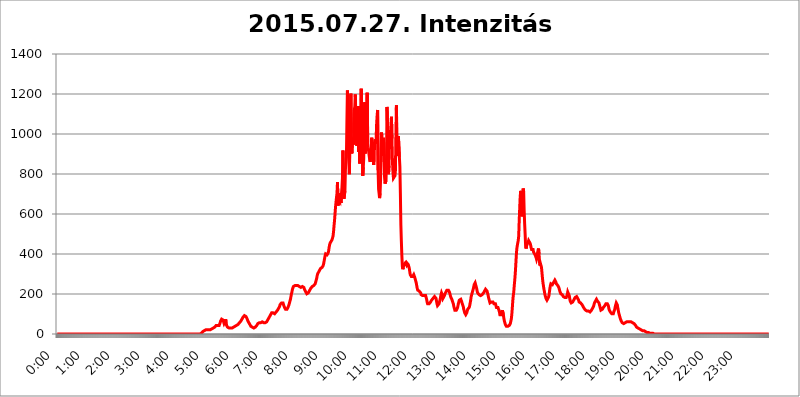
| Category | 2015.07.27. Intenzitás [W/m^2] |
|---|---|
| 0.0 | 0 |
| 0.0006944444444444445 | 0 |
| 0.001388888888888889 | 0 |
| 0.0020833333333333333 | 0 |
| 0.002777777777777778 | 0 |
| 0.003472222222222222 | 0 |
| 0.004166666666666667 | 0 |
| 0.004861111111111111 | 0 |
| 0.005555555555555556 | 0 |
| 0.0062499999999999995 | 0 |
| 0.006944444444444444 | 0 |
| 0.007638888888888889 | 0 |
| 0.008333333333333333 | 0 |
| 0.009027777777777779 | 0 |
| 0.009722222222222222 | 0 |
| 0.010416666666666666 | 0 |
| 0.011111111111111112 | 0 |
| 0.011805555555555555 | 0 |
| 0.012499999999999999 | 0 |
| 0.013194444444444444 | 0 |
| 0.013888888888888888 | 0 |
| 0.014583333333333332 | 0 |
| 0.015277777777777777 | 0 |
| 0.015972222222222224 | 0 |
| 0.016666666666666666 | 0 |
| 0.017361111111111112 | 0 |
| 0.018055555555555557 | 0 |
| 0.01875 | 0 |
| 0.019444444444444445 | 0 |
| 0.02013888888888889 | 0 |
| 0.020833333333333332 | 0 |
| 0.02152777777777778 | 0 |
| 0.022222222222222223 | 0 |
| 0.02291666666666667 | 0 |
| 0.02361111111111111 | 0 |
| 0.024305555555555556 | 0 |
| 0.024999999999999998 | 0 |
| 0.025694444444444447 | 0 |
| 0.02638888888888889 | 0 |
| 0.027083333333333334 | 0 |
| 0.027777777777777776 | 0 |
| 0.02847222222222222 | 0 |
| 0.029166666666666664 | 0 |
| 0.029861111111111113 | 0 |
| 0.030555555555555555 | 0 |
| 0.03125 | 0 |
| 0.03194444444444445 | 0 |
| 0.03263888888888889 | 0 |
| 0.03333333333333333 | 0 |
| 0.034027777777777775 | 0 |
| 0.034722222222222224 | 0 |
| 0.035416666666666666 | 0 |
| 0.036111111111111115 | 0 |
| 0.03680555555555556 | 0 |
| 0.0375 | 0 |
| 0.03819444444444444 | 0 |
| 0.03888888888888889 | 0 |
| 0.03958333333333333 | 0 |
| 0.04027777777777778 | 0 |
| 0.04097222222222222 | 0 |
| 0.041666666666666664 | 0 |
| 0.042361111111111106 | 0 |
| 0.04305555555555556 | 0 |
| 0.043750000000000004 | 0 |
| 0.044444444444444446 | 0 |
| 0.04513888888888889 | 0 |
| 0.04583333333333334 | 0 |
| 0.04652777777777778 | 0 |
| 0.04722222222222222 | 0 |
| 0.04791666666666666 | 0 |
| 0.04861111111111111 | 0 |
| 0.049305555555555554 | 0 |
| 0.049999999999999996 | 0 |
| 0.05069444444444445 | 0 |
| 0.051388888888888894 | 0 |
| 0.052083333333333336 | 0 |
| 0.05277777777777778 | 0 |
| 0.05347222222222222 | 0 |
| 0.05416666666666667 | 0 |
| 0.05486111111111111 | 0 |
| 0.05555555555555555 | 0 |
| 0.05625 | 0 |
| 0.05694444444444444 | 0 |
| 0.057638888888888885 | 0 |
| 0.05833333333333333 | 0 |
| 0.05902777777777778 | 0 |
| 0.059722222222222225 | 0 |
| 0.06041666666666667 | 0 |
| 0.061111111111111116 | 0 |
| 0.06180555555555556 | 0 |
| 0.0625 | 0 |
| 0.06319444444444444 | 0 |
| 0.06388888888888888 | 0 |
| 0.06458333333333334 | 0 |
| 0.06527777777777778 | 0 |
| 0.06597222222222222 | 0 |
| 0.06666666666666667 | 0 |
| 0.06736111111111111 | 0 |
| 0.06805555555555555 | 0 |
| 0.06874999999999999 | 0 |
| 0.06944444444444443 | 0 |
| 0.07013888888888889 | 0 |
| 0.07083333333333333 | 0 |
| 0.07152777777777779 | 0 |
| 0.07222222222222223 | 0 |
| 0.07291666666666667 | 0 |
| 0.07361111111111111 | 0 |
| 0.07430555555555556 | 0 |
| 0.075 | 0 |
| 0.07569444444444444 | 0 |
| 0.0763888888888889 | 0 |
| 0.07708333333333334 | 0 |
| 0.07777777777777778 | 0 |
| 0.07847222222222222 | 0 |
| 0.07916666666666666 | 0 |
| 0.0798611111111111 | 0 |
| 0.08055555555555556 | 0 |
| 0.08125 | 0 |
| 0.08194444444444444 | 0 |
| 0.08263888888888889 | 0 |
| 0.08333333333333333 | 0 |
| 0.08402777777777777 | 0 |
| 0.08472222222222221 | 0 |
| 0.08541666666666665 | 0 |
| 0.08611111111111112 | 0 |
| 0.08680555555555557 | 0 |
| 0.08750000000000001 | 0 |
| 0.08819444444444445 | 0 |
| 0.08888888888888889 | 0 |
| 0.08958333333333333 | 0 |
| 0.09027777777777778 | 0 |
| 0.09097222222222222 | 0 |
| 0.09166666666666667 | 0 |
| 0.09236111111111112 | 0 |
| 0.09305555555555556 | 0 |
| 0.09375 | 0 |
| 0.09444444444444444 | 0 |
| 0.09513888888888888 | 0 |
| 0.09583333333333333 | 0 |
| 0.09652777777777777 | 0 |
| 0.09722222222222222 | 0 |
| 0.09791666666666667 | 0 |
| 0.09861111111111111 | 0 |
| 0.09930555555555555 | 0 |
| 0.09999999999999999 | 0 |
| 0.10069444444444443 | 0 |
| 0.1013888888888889 | 0 |
| 0.10208333333333335 | 0 |
| 0.10277777777777779 | 0 |
| 0.10347222222222223 | 0 |
| 0.10416666666666667 | 0 |
| 0.10486111111111111 | 0 |
| 0.10555555555555556 | 0 |
| 0.10625 | 0 |
| 0.10694444444444444 | 0 |
| 0.1076388888888889 | 0 |
| 0.10833333333333334 | 0 |
| 0.10902777777777778 | 0 |
| 0.10972222222222222 | 0 |
| 0.1111111111111111 | 0 |
| 0.11180555555555556 | 0 |
| 0.11180555555555556 | 0 |
| 0.1125 | 0 |
| 0.11319444444444444 | 0 |
| 0.11388888888888889 | 0 |
| 0.11458333333333333 | 0 |
| 0.11527777777777777 | 0 |
| 0.11597222222222221 | 0 |
| 0.11666666666666665 | 0 |
| 0.1173611111111111 | 0 |
| 0.11805555555555557 | 0 |
| 0.11944444444444445 | 0 |
| 0.12013888888888889 | 0 |
| 0.12083333333333333 | 0 |
| 0.12152777777777778 | 0 |
| 0.12222222222222223 | 0 |
| 0.12291666666666667 | 0 |
| 0.12291666666666667 | 0 |
| 0.12361111111111112 | 0 |
| 0.12430555555555556 | 0 |
| 0.125 | 0 |
| 0.12569444444444444 | 0 |
| 0.12638888888888888 | 0 |
| 0.12708333333333333 | 0 |
| 0.16875 | 0 |
| 0.12847222222222224 | 0 |
| 0.12916666666666668 | 0 |
| 0.12986111111111112 | 0 |
| 0.13055555555555556 | 0 |
| 0.13125 | 0 |
| 0.13194444444444445 | 0 |
| 0.1326388888888889 | 0 |
| 0.13333333333333333 | 0 |
| 0.13402777777777777 | 0 |
| 0.13402777777777777 | 0 |
| 0.13472222222222222 | 0 |
| 0.13541666666666666 | 0 |
| 0.1361111111111111 | 0 |
| 0.13749999999999998 | 0 |
| 0.13819444444444443 | 0 |
| 0.1388888888888889 | 0 |
| 0.13958333333333334 | 0 |
| 0.14027777777777778 | 0 |
| 0.14097222222222222 | 0 |
| 0.14166666666666666 | 0 |
| 0.1423611111111111 | 0 |
| 0.14305555555555557 | 0 |
| 0.14375000000000002 | 0 |
| 0.14444444444444446 | 0 |
| 0.1451388888888889 | 0 |
| 0.1451388888888889 | 0 |
| 0.14652777777777778 | 0 |
| 0.14722222222222223 | 0 |
| 0.14791666666666667 | 0 |
| 0.1486111111111111 | 0 |
| 0.14930555555555555 | 0 |
| 0.15 | 0 |
| 0.15069444444444444 | 0 |
| 0.15138888888888888 | 0 |
| 0.15208333333333332 | 0 |
| 0.15277777777777776 | 0 |
| 0.15347222222222223 | 0 |
| 0.15416666666666667 | 0 |
| 0.15486111111111112 | 0 |
| 0.15555555555555556 | 0 |
| 0.15625 | 0 |
| 0.15694444444444444 | 0 |
| 0.15763888888888888 | 0 |
| 0.15833333333333333 | 0 |
| 0.15902777777777777 | 0 |
| 0.15972222222222224 | 0 |
| 0.16041666666666668 | 0 |
| 0.16111111111111112 | 0 |
| 0.16180555555555556 | 0 |
| 0.1625 | 0 |
| 0.16319444444444445 | 0 |
| 0.1638888888888889 | 0 |
| 0.16458333333333333 | 0 |
| 0.16527777777777777 | 0 |
| 0.16597222222222222 | 0 |
| 0.16666666666666666 | 0 |
| 0.1673611111111111 | 0 |
| 0.16805555555555554 | 0 |
| 0.16874999999999998 | 0 |
| 0.16944444444444443 | 0 |
| 0.17013888888888887 | 0 |
| 0.1708333333333333 | 0 |
| 0.17152777777777775 | 0 |
| 0.17222222222222225 | 0 |
| 0.1729166666666667 | 0 |
| 0.17361111111111113 | 0 |
| 0.17430555555555557 | 0 |
| 0.17500000000000002 | 0 |
| 0.17569444444444446 | 0 |
| 0.1763888888888889 | 0 |
| 0.17708333333333334 | 0 |
| 0.17777777777777778 | 0 |
| 0.17847222222222223 | 0 |
| 0.17916666666666667 | 0 |
| 0.1798611111111111 | 0 |
| 0.18055555555555555 | 0 |
| 0.18125 | 0 |
| 0.18194444444444444 | 0 |
| 0.1826388888888889 | 0 |
| 0.18333333333333335 | 0 |
| 0.1840277777777778 | 0 |
| 0.18472222222222223 | 0 |
| 0.18541666666666667 | 0 |
| 0.18611111111111112 | 0 |
| 0.18680555555555556 | 0 |
| 0.1875 | 0 |
| 0.18819444444444444 | 0 |
| 0.18888888888888888 | 0 |
| 0.18958333333333333 | 0 |
| 0.19027777777777777 | 0 |
| 0.1909722222222222 | 0 |
| 0.19166666666666665 | 0 |
| 0.19236111111111112 | 0 |
| 0.19305555555555554 | 0 |
| 0.19375 | 0 |
| 0.19444444444444445 | 0 |
| 0.1951388888888889 | 0 |
| 0.19583333333333333 | 0 |
| 0.19652777777777777 | 0 |
| 0.19722222222222222 | 0 |
| 0.19791666666666666 | 0 |
| 0.1986111111111111 | 0 |
| 0.19930555555555554 | 0 |
| 0.19999999999999998 | 0 |
| 0.20069444444444443 | 3.525 |
| 0.20138888888888887 | 3.525 |
| 0.2020833333333333 | 3.525 |
| 0.2027777777777778 | 7.887 |
| 0.2034722222222222 | 7.887 |
| 0.2041666666666667 | 12.257 |
| 0.20486111111111113 | 12.257 |
| 0.20555555555555557 | 12.257 |
| 0.20625000000000002 | 16.636 |
| 0.20694444444444446 | 16.636 |
| 0.2076388888888889 | 21.024 |
| 0.20833333333333334 | 21.024 |
| 0.20902777777777778 | 21.024 |
| 0.20972222222222223 | 21.024 |
| 0.21041666666666667 | 21.024 |
| 0.2111111111111111 | 21.024 |
| 0.21180555555555555 | 21.024 |
| 0.2125 | 21.024 |
| 0.21319444444444444 | 21.024 |
| 0.2138888888888889 | 21.024 |
| 0.21458333333333335 | 21.024 |
| 0.2152777777777778 | 21.024 |
| 0.21597222222222223 | 21.024 |
| 0.21666666666666667 | 25.419 |
| 0.21736111111111112 | 25.419 |
| 0.21805555555555556 | 25.419 |
| 0.21875 | 29.823 |
| 0.21944444444444444 | 29.823 |
| 0.22013888888888888 | 29.823 |
| 0.22083333333333333 | 34.234 |
| 0.22152777777777777 | 38.653 |
| 0.2222222222222222 | 38.653 |
| 0.22291666666666665 | 43.079 |
| 0.2236111111111111 | 43.079 |
| 0.22430555555555556 | 43.079 |
| 0.225 | 43.079 |
| 0.22569444444444445 | 43.079 |
| 0.2263888888888889 | 43.079 |
| 0.22708333333333333 | 43.079 |
| 0.22777777777777777 | 47.511 |
| 0.22847222222222222 | 56.398 |
| 0.22916666666666666 | 65.31 |
| 0.2298611111111111 | 69.775 |
| 0.23055555555555554 | 74.246 |
| 0.23124999999999998 | 74.246 |
| 0.23194444444444443 | 74.246 |
| 0.23263888888888887 | 69.775 |
| 0.2333333333333333 | 60.85 |
| 0.2340277777777778 | 51.951 |
| 0.2347222222222222 | 47.511 |
| 0.2354166666666667 | 60.85 |
| 0.23611111111111113 | 74.246 |
| 0.23680555555555557 | 60.85 |
| 0.23750000000000002 | 43.079 |
| 0.23819444444444446 | 38.653 |
| 0.2388888888888889 | 34.234 |
| 0.23958333333333334 | 34.234 |
| 0.24027777777777778 | 34.234 |
| 0.24097222222222223 | 29.823 |
| 0.24166666666666667 | 29.823 |
| 0.2423611111111111 | 29.823 |
| 0.24305555555555555 | 29.823 |
| 0.24375 | 29.823 |
| 0.24444444444444446 | 29.823 |
| 0.24513888888888888 | 29.823 |
| 0.24583333333333335 | 29.823 |
| 0.2465277777777778 | 34.234 |
| 0.24722222222222223 | 34.234 |
| 0.24791666666666667 | 34.234 |
| 0.24861111111111112 | 38.653 |
| 0.24930555555555556 | 38.653 |
| 0.25 | 38.653 |
| 0.25069444444444444 | 38.653 |
| 0.2513888888888889 | 43.079 |
| 0.2520833333333333 | 43.079 |
| 0.25277777777777777 | 47.511 |
| 0.2534722222222222 | 47.511 |
| 0.25416666666666665 | 47.511 |
| 0.2548611111111111 | 51.951 |
| 0.2555555555555556 | 56.398 |
| 0.25625000000000003 | 56.398 |
| 0.2569444444444445 | 60.85 |
| 0.2576388888888889 | 65.31 |
| 0.25833333333333336 | 69.775 |
| 0.2590277777777778 | 74.246 |
| 0.25972222222222224 | 78.722 |
| 0.2604166666666667 | 83.205 |
| 0.2611111111111111 | 87.692 |
| 0.26180555555555557 | 87.692 |
| 0.2625 | 92.184 |
| 0.26319444444444445 | 92.184 |
| 0.2638888888888889 | 87.692 |
| 0.26458333333333334 | 87.692 |
| 0.2652777777777778 | 83.205 |
| 0.2659722222222222 | 78.722 |
| 0.26666666666666666 | 74.246 |
| 0.2673611111111111 | 65.31 |
| 0.26805555555555555 | 60.85 |
| 0.26875 | 56.398 |
| 0.26944444444444443 | 51.951 |
| 0.2701388888888889 | 47.511 |
| 0.2708333333333333 | 43.079 |
| 0.27152777777777776 | 38.653 |
| 0.2722222222222222 | 38.653 |
| 0.27291666666666664 | 38.653 |
| 0.2736111111111111 | 34.234 |
| 0.2743055555555555 | 34.234 |
| 0.27499999999999997 | 34.234 |
| 0.27569444444444446 | 29.823 |
| 0.27638888888888885 | 34.234 |
| 0.27708333333333335 | 34.234 |
| 0.2777777777777778 | 34.234 |
| 0.27847222222222223 | 38.653 |
| 0.2791666666666667 | 38.653 |
| 0.2798611111111111 | 43.079 |
| 0.28055555555555556 | 47.511 |
| 0.28125 | 51.951 |
| 0.28194444444444444 | 51.951 |
| 0.2826388888888889 | 56.398 |
| 0.2833333333333333 | 56.398 |
| 0.28402777777777777 | 56.398 |
| 0.2847222222222222 | 56.398 |
| 0.28541666666666665 | 56.398 |
| 0.28611111111111115 | 56.398 |
| 0.28680555555555554 | 60.85 |
| 0.28750000000000003 | 60.85 |
| 0.2881944444444445 | 60.85 |
| 0.2888888888888889 | 56.398 |
| 0.28958333333333336 | 56.398 |
| 0.2902777777777778 | 56.398 |
| 0.29097222222222224 | 56.398 |
| 0.2916666666666667 | 56.398 |
| 0.2923611111111111 | 56.398 |
| 0.29305555555555557 | 56.398 |
| 0.29375 | 60.85 |
| 0.29444444444444445 | 65.31 |
| 0.2951388888888889 | 69.775 |
| 0.29583333333333334 | 74.246 |
| 0.2965277777777778 | 78.722 |
| 0.2972222222222222 | 83.205 |
| 0.29791666666666666 | 87.692 |
| 0.2986111111111111 | 92.184 |
| 0.29930555555555555 | 96.682 |
| 0.3 | 101.184 |
| 0.30069444444444443 | 105.69 |
| 0.3013888888888889 | 105.69 |
| 0.3020833333333333 | 105.69 |
| 0.30277777777777776 | 105.69 |
| 0.3034722222222222 | 105.69 |
| 0.30416666666666664 | 101.184 |
| 0.3048611111111111 | 101.184 |
| 0.3055555555555555 | 101.184 |
| 0.30624999999999997 | 105.69 |
| 0.3069444444444444 | 110.201 |
| 0.3076388888888889 | 114.716 |
| 0.30833333333333335 | 114.716 |
| 0.3090277777777778 | 119.235 |
| 0.30972222222222223 | 123.758 |
| 0.3104166666666667 | 128.284 |
| 0.3111111111111111 | 132.814 |
| 0.31180555555555556 | 137.347 |
| 0.3125 | 146.423 |
| 0.31319444444444444 | 150.964 |
| 0.3138888888888889 | 150.964 |
| 0.3145833333333333 | 155.509 |
| 0.31527777777777777 | 155.509 |
| 0.3159722222222222 | 155.509 |
| 0.31666666666666665 | 155.509 |
| 0.31736111111111115 | 146.423 |
| 0.31805555555555554 | 141.884 |
| 0.31875000000000003 | 132.814 |
| 0.3194444444444445 | 128.284 |
| 0.3201388888888889 | 123.758 |
| 0.32083333333333336 | 123.758 |
| 0.3215277777777778 | 123.758 |
| 0.32222222222222224 | 123.758 |
| 0.3229166666666667 | 128.284 |
| 0.3236111111111111 | 132.814 |
| 0.32430555555555557 | 137.347 |
| 0.325 | 146.423 |
| 0.32569444444444445 | 155.509 |
| 0.3263888888888889 | 164.605 |
| 0.32708333333333334 | 173.709 |
| 0.3277777777777778 | 187.378 |
| 0.3284722222222222 | 201.058 |
| 0.32916666666666666 | 210.182 |
| 0.3298611111111111 | 223.873 |
| 0.33055555555555555 | 228.436 |
| 0.33125 | 237.564 |
| 0.33194444444444443 | 242.127 |
| 0.3326388888888889 | 242.127 |
| 0.3333333333333333 | 242.127 |
| 0.3340277777777778 | 242.127 |
| 0.3347222222222222 | 242.127 |
| 0.3354166666666667 | 242.127 |
| 0.3361111111111111 | 242.127 |
| 0.3368055555555556 | 242.127 |
| 0.33749999999999997 | 242.127 |
| 0.33819444444444446 | 242.127 |
| 0.33888888888888885 | 237.564 |
| 0.33958333333333335 | 237.564 |
| 0.34027777777777773 | 233 |
| 0.34097222222222223 | 233 |
| 0.3416666666666666 | 233 |
| 0.3423611111111111 | 233 |
| 0.3430555555555555 | 233 |
| 0.34375 | 237.564 |
| 0.3444444444444445 | 237.564 |
| 0.3451388888888889 | 233 |
| 0.3458333333333334 | 233 |
| 0.34652777777777777 | 228.436 |
| 0.34722222222222227 | 219.309 |
| 0.34791666666666665 | 214.746 |
| 0.34861111111111115 | 210.182 |
| 0.34930555555555554 | 205.62 |
| 0.35000000000000003 | 201.058 |
| 0.3506944444444444 | 201.058 |
| 0.3513888888888889 | 201.058 |
| 0.3520833333333333 | 205.62 |
| 0.3527777777777778 | 205.62 |
| 0.3534722222222222 | 210.182 |
| 0.3541666666666667 | 219.309 |
| 0.3548611111111111 | 223.873 |
| 0.35555555555555557 | 228.436 |
| 0.35625 | 233 |
| 0.35694444444444445 | 233 |
| 0.3576388888888889 | 237.564 |
| 0.35833333333333334 | 237.564 |
| 0.3590277777777778 | 237.564 |
| 0.3597222222222222 | 242.127 |
| 0.36041666666666666 | 242.127 |
| 0.3611111111111111 | 246.689 |
| 0.36180555555555555 | 251.251 |
| 0.3625 | 260.373 |
| 0.36319444444444443 | 269.49 |
| 0.3638888888888889 | 278.603 |
| 0.3645833333333333 | 292.259 |
| 0.3652777777777778 | 301.354 |
| 0.3659722222222222 | 305.898 |
| 0.3666666666666667 | 310.44 |
| 0.3673611111111111 | 314.98 |
| 0.3680555555555556 | 319.517 |
| 0.36874999999999997 | 324.052 |
| 0.36944444444444446 | 328.584 |
| 0.37013888888888885 | 333.113 |
| 0.37083333333333335 | 333.113 |
| 0.37152777777777773 | 333.113 |
| 0.37222222222222223 | 333.113 |
| 0.3729166666666666 | 342.162 |
| 0.3736111111111111 | 351.198 |
| 0.3743055555555555 | 364.728 |
| 0.375 | 378.224 |
| 0.3756944444444445 | 391.685 |
| 0.3763888888888889 | 400.638 |
| 0.3770833333333334 | 400.638 |
| 0.37777777777777777 | 400.638 |
| 0.37847222222222227 | 396.164 |
| 0.37916666666666665 | 396.164 |
| 0.37986111111111115 | 405.108 |
| 0.38055555555555554 | 414.035 |
| 0.38125000000000003 | 431.833 |
| 0.3819444444444444 | 445.129 |
| 0.3826388888888889 | 453.968 |
| 0.3833333333333333 | 458.38 |
| 0.3840277777777778 | 462.786 |
| 0.3847222222222222 | 467.187 |
| 0.3854166666666667 | 471.582 |
| 0.3861111111111111 | 475.972 |
| 0.38680555555555557 | 489.108 |
| 0.3875 | 510.885 |
| 0.38819444444444445 | 541.121 |
| 0.3888888888888889 | 566.793 |
| 0.38958333333333334 | 600.661 |
| 0.3902777777777778 | 634.105 |
| 0.3909722222222222 | 658.909 |
| 0.39166666666666666 | 683.473 |
| 0.3923611111111111 | 703.762 |
| 0.39305555555555555 | 759.723 |
| 0.39375 | 642.4 |
| 0.39444444444444443 | 642.4 |
| 0.3951388888888889 | 671.22 |
| 0.3958333333333333 | 675.311 |
| 0.3965277777777778 | 663.019 |
| 0.3972222222222222 | 703.762 |
| 0.3979166666666667 | 654.791 |
| 0.3986111111111111 | 699.717 |
| 0.3993055555555556 | 731.896 |
| 0.39999999999999997 | 779.42 |
| 0.40069444444444446 | 917.534 |
| 0.40138888888888885 | 719.877 |
| 0.40208333333333335 | 675.311 |
| 0.40277777777777773 | 679.395 |
| 0.40347222222222223 | 715.858 |
| 0.4041666666666666 | 822.26 |
| 0.4048611111111111 | 822.26 |
| 0.4055555555555555 | 883.516 |
| 0.40625 | 1059.756 |
| 0.4069444444444445 | 1217.812 |
| 0.4076388888888889 | 1162.571 |
| 0.4083333333333334 | 1105.019 |
| 0.40902777777777777 | 872.114 |
| 0.40972222222222227 | 798.974 |
| 0.41041666666666665 | 977.508 |
| 0.41111111111111115 | 1101.226 |
| 0.41180555555555554 | 1201.843 |
| 0.41250000000000003 | 1003.65 |
| 0.4131944444444444 | 902.447 |
| 0.4138888888888889 | 955.071 |
| 0.4145833333333333 | 962.555 |
| 0.4152777777777778 | 981.244 |
| 0.4159722222222222 | 947.58 |
| 0.4166666666666667 | 1120.238 |
| 0.4173611111111111 | 1139.384 |
| 0.41805555555555557 | 1197.876 |
| 0.41875 | 1086.097 |
| 0.41944444444444445 | 973.772 |
| 0.4201388888888889 | 940.082 |
| 0.42083333333333334 | 955.071 |
| 0.4215277777777778 | 947.58 |
| 0.4222222222222222 | 1139.384 |
| 0.42291666666666666 | 909.996 |
| 0.4236111111111111 | 970.034 |
| 0.42430555555555555 | 853.029 |
| 0.425 | 1101.226 |
| 0.42569444444444443 | 996.182 |
| 0.4263888888888889 | 1225.859 |
| 0.4270833333333333 | 1029.798 |
| 0.4277777777777778 | 1041.019 |
| 0.4284722222222222 | 791.169 |
| 0.4291666666666667 | 833.834 |
| 0.4298611111111111 | 875.918 |
| 0.4305555555555556 | 1078.555 |
| 0.43124999999999997 | 1158.689 |
| 0.43194444444444446 | 902.447 |
| 0.43263888888888885 | 1131.708 |
| 0.43333333333333335 | 1074.789 |
| 0.43402777777777773 | 951.327 |
| 0.43472222222222223 | 1205.82 |
| 0.4354166666666666 | 958.814 |
| 0.4361111111111111 | 932.576 |
| 0.4368055555555555 | 932.576 |
| 0.4375 | 891.099 |
| 0.4381944444444445 | 872.114 |
| 0.4388888888888889 | 860.676 |
| 0.4395833333333334 | 925.06 |
| 0.44027777777777777 | 898.668 |
| 0.44097222222222227 | 981.244 |
| 0.44166666666666665 | 902.447 |
| 0.44236111111111115 | 872.114 |
| 0.44305555555555554 | 906.223 |
| 0.44375000000000003 | 845.365 |
| 0.4444444444444444 | 879.719 |
| 0.4451388888888889 | 962.555 |
| 0.4458333333333333 | 973.772 |
| 0.4465277777777778 | 951.327 |
| 0.4472222222222222 | 970.034 |
| 0.4479166666666667 | 1048.508 |
| 0.4486111111111111 | 1089.873 |
| 0.44930555555555557 | 1120.238 |
| 0.45 | 818.392 |
| 0.45069444444444445 | 723.889 |
| 0.4513888888888889 | 703.762 |
| 0.45208333333333334 | 679.395 |
| 0.4527777777777778 | 703.762 |
| 0.4534722222222222 | 771.559 |
| 0.45416666666666666 | 925.06 |
| 0.4548611111111111 | 1007.383 |
| 0.45555555555555555 | 962.555 |
| 0.45625 | 891.099 |
| 0.45694444444444443 | 936.33 |
| 0.4576388888888889 | 981.244 |
| 0.4583333333333333 | 860.676 |
| 0.4590277777777778 | 787.258 |
| 0.4597222222222222 | 751.803 |
| 0.4604166666666667 | 751.803 |
| 0.4611111111111111 | 767.62 |
| 0.4618055555555556 | 875.918 |
| 0.46249999999999997 | 1135.543 |
| 0.46319444444444446 | 1044.762 |
| 0.46388888888888885 | 860.676 |
| 0.46458333333333335 | 798.974 |
| 0.46527777777777773 | 841.526 |
| 0.46597222222222223 | 947.58 |
| 0.4666666666666666 | 999.916 |
| 0.4673611111111111 | 1007.383 |
| 0.4680555555555555 | 1007.383 |
| 0.46875 | 1086.097 |
| 0.4694444444444445 | 977.508 |
| 0.4701388888888889 | 860.676 |
| 0.4708333333333334 | 810.641 |
| 0.47152777777777777 | 779.42 |
| 0.47222222222222227 | 779.42 |
| 0.47291666666666665 | 783.342 |
| 0.47361111111111115 | 791.169 |
| 0.47430555555555554 | 818.392 |
| 0.47500000000000003 | 999.916 |
| 0.4756944444444444 | 1143.232 |
| 0.4763888888888889 | 917.534 |
| 0.4770833333333333 | 984.98 |
| 0.4777777777777778 | 891.099 |
| 0.4784722222222222 | 988.714 |
| 0.4791666666666667 | 992.448 |
| 0.4798611111111111 | 883.516 |
| 0.48055555555555557 | 837.682 |
| 0.48125 | 703.762 |
| 0.48194444444444445 | 545.416 |
| 0.4826388888888889 | 462.786 |
| 0.48333333333333334 | 391.685 |
| 0.4840277777777778 | 337.639 |
| 0.4847222222222222 | 324.052 |
| 0.48541666666666666 | 333.113 |
| 0.4861111111111111 | 346.682 |
| 0.48680555555555555 | 351.198 |
| 0.4875 | 351.198 |
| 0.48819444444444443 | 355.712 |
| 0.4888888888888889 | 351.198 |
| 0.4895833333333333 | 346.682 |
| 0.4902777777777778 | 355.712 |
| 0.4909722222222222 | 355.712 |
| 0.4916666666666667 | 351.198 |
| 0.4923611111111111 | 346.682 |
| 0.4930555555555556 | 337.639 |
| 0.49374999999999997 | 328.584 |
| 0.49444444444444446 | 310.44 |
| 0.49513888888888885 | 296.808 |
| 0.49583333333333335 | 292.259 |
| 0.49652777777777773 | 287.709 |
| 0.49722222222222223 | 287.709 |
| 0.4979166666666666 | 287.709 |
| 0.4986111111111111 | 287.709 |
| 0.4993055555555555 | 292.259 |
| 0.5 | 296.808 |
| 0.5006944444444444 | 292.259 |
| 0.5013888888888889 | 283.156 |
| 0.5020833333333333 | 274.047 |
| 0.5027777777777778 | 264.932 |
| 0.5034722222222222 | 255.813 |
| 0.5041666666666667 | 242.127 |
| 0.5048611111111111 | 228.436 |
| 0.5055555555555555 | 219.309 |
| 0.50625 | 214.746 |
| 0.5069444444444444 | 214.746 |
| 0.5076388888888889 | 214.746 |
| 0.5083333333333333 | 214.746 |
| 0.5090277777777777 | 210.182 |
| 0.5097222222222222 | 205.62 |
| 0.5104166666666666 | 196.497 |
| 0.5111111111111112 | 191.937 |
| 0.5118055555555555 | 191.937 |
| 0.5125000000000001 | 191.937 |
| 0.5131944444444444 | 191.937 |
| 0.513888888888889 | 191.937 |
| 0.5145833333333333 | 191.937 |
| 0.5152777777777778 | 196.497 |
| 0.5159722222222222 | 196.497 |
| 0.5166666666666667 | 191.937 |
| 0.517361111111111 | 182.82 |
| 0.5180555555555556 | 173.709 |
| 0.5187499999999999 | 160.056 |
| 0.5194444444444445 | 150.964 |
| 0.5201388888888888 | 146.423 |
| 0.5208333333333334 | 146.423 |
| 0.5215277777777778 | 150.964 |
| 0.5222222222222223 | 150.964 |
| 0.5229166666666667 | 155.509 |
| 0.5236111111111111 | 160.056 |
| 0.5243055555555556 | 164.605 |
| 0.525 | 169.156 |
| 0.5256944444444445 | 173.709 |
| 0.5263888888888889 | 173.709 |
| 0.5270833333333333 | 178.264 |
| 0.5277777777777778 | 182.82 |
| 0.5284722222222222 | 182.82 |
| 0.5291666666666667 | 187.378 |
| 0.5298611111111111 | 187.378 |
| 0.5305555555555556 | 182.82 |
| 0.53125 | 178.264 |
| 0.5319444444444444 | 164.605 |
| 0.5326388888888889 | 150.964 |
| 0.5333333333333333 | 141.884 |
| 0.5340277777777778 | 141.884 |
| 0.5347222222222222 | 146.423 |
| 0.5354166666666667 | 150.964 |
| 0.5361111111111111 | 155.509 |
| 0.5368055555555555 | 169.156 |
| 0.5375 | 182.82 |
| 0.5381944444444444 | 196.497 |
| 0.5388888888888889 | 205.62 |
| 0.5395833333333333 | 201.058 |
| 0.5402777777777777 | 191.937 |
| 0.5409722222222222 | 178.264 |
| 0.5416666666666666 | 178.264 |
| 0.5423611111111112 | 182.82 |
| 0.5430555555555555 | 191.937 |
| 0.5437500000000001 | 201.058 |
| 0.5444444444444444 | 205.62 |
| 0.545138888888889 | 210.182 |
| 0.5458333333333333 | 214.746 |
| 0.5465277777777778 | 219.309 |
| 0.5472222222222222 | 219.309 |
| 0.5479166666666667 | 219.309 |
| 0.548611111111111 | 219.309 |
| 0.5493055555555556 | 214.746 |
| 0.5499999999999999 | 210.182 |
| 0.5506944444444445 | 201.058 |
| 0.5513888888888888 | 191.937 |
| 0.5520833333333334 | 182.82 |
| 0.5527777777777778 | 178.264 |
| 0.5534722222222223 | 173.709 |
| 0.5541666666666667 | 164.605 |
| 0.5548611111111111 | 160.056 |
| 0.5555555555555556 | 150.964 |
| 0.55625 | 137.347 |
| 0.5569444444444445 | 128.284 |
| 0.5576388888888889 | 119.235 |
| 0.5583333333333333 | 114.716 |
| 0.5590277777777778 | 114.716 |
| 0.5597222222222222 | 119.235 |
| 0.5604166666666667 | 119.235 |
| 0.5611111111111111 | 128.284 |
| 0.5618055555555556 | 137.347 |
| 0.5625 | 150.964 |
| 0.5631944444444444 | 160.056 |
| 0.5638888888888889 | 169.156 |
| 0.5645833333333333 | 173.709 |
| 0.5652777777777778 | 173.709 |
| 0.5659722222222222 | 173.709 |
| 0.5666666666666667 | 169.156 |
| 0.5673611111111111 | 160.056 |
| 0.5680555555555555 | 150.964 |
| 0.56875 | 146.423 |
| 0.5694444444444444 | 137.347 |
| 0.5701388888888889 | 123.758 |
| 0.5708333333333333 | 114.716 |
| 0.5715277777777777 | 105.69 |
| 0.5722222222222222 | 101.184 |
| 0.5729166666666666 | 96.682 |
| 0.5736111111111112 | 101.184 |
| 0.5743055555555555 | 105.69 |
| 0.5750000000000001 | 114.716 |
| 0.5756944444444444 | 123.758 |
| 0.576388888888889 | 128.284 |
| 0.5770833333333333 | 128.284 |
| 0.5777777777777778 | 132.814 |
| 0.5784722222222222 | 141.884 |
| 0.5791666666666667 | 155.509 |
| 0.579861111111111 | 169.156 |
| 0.5805555555555556 | 187.378 |
| 0.5812499999999999 | 196.497 |
| 0.5819444444444445 | 205.62 |
| 0.5826388888888888 | 214.746 |
| 0.5833333333333334 | 223.873 |
| 0.5840277777777778 | 233 |
| 0.5847222222222223 | 246.689 |
| 0.5854166666666667 | 251.251 |
| 0.5861111111111111 | 255.813 |
| 0.5868055555555556 | 246.689 |
| 0.5875 | 237.564 |
| 0.5881944444444445 | 228.436 |
| 0.5888888888888889 | 214.746 |
| 0.5895833333333333 | 205.62 |
| 0.5902777777777778 | 201.058 |
| 0.5909722222222222 | 201.058 |
| 0.5916666666666667 | 196.497 |
| 0.5923611111111111 | 196.497 |
| 0.5930555555555556 | 191.937 |
| 0.59375 | 191.937 |
| 0.5944444444444444 | 191.937 |
| 0.5951388888888889 | 191.937 |
| 0.5958333333333333 | 196.497 |
| 0.5965277777777778 | 196.497 |
| 0.5972222222222222 | 201.058 |
| 0.5979166666666667 | 205.62 |
| 0.5986111111111111 | 210.182 |
| 0.5993055555555555 | 214.746 |
| 0.6 | 219.309 |
| 0.6006944444444444 | 223.873 |
| 0.6013888888888889 | 223.873 |
| 0.6020833333333333 | 219.309 |
| 0.6027777777777777 | 214.746 |
| 0.6034722222222222 | 205.62 |
| 0.6041666666666666 | 196.497 |
| 0.6048611111111112 | 182.82 |
| 0.6055555555555555 | 173.709 |
| 0.6062500000000001 | 164.605 |
| 0.6069444444444444 | 155.509 |
| 0.607638888888889 | 150.964 |
| 0.6083333333333333 | 155.509 |
| 0.6090277777777778 | 160.056 |
| 0.6097222222222222 | 164.605 |
| 0.6104166666666667 | 164.605 |
| 0.611111111111111 | 160.056 |
| 0.6118055555555556 | 155.509 |
| 0.6124999999999999 | 150.964 |
| 0.6131944444444445 | 150.964 |
| 0.6138888888888888 | 155.509 |
| 0.6145833333333334 | 150.964 |
| 0.6152777777777778 | 141.884 |
| 0.6159722222222223 | 132.814 |
| 0.6166666666666667 | 132.814 |
| 0.6173611111111111 | 137.347 |
| 0.6180555555555556 | 132.814 |
| 0.61875 | 128.284 |
| 0.6194444444444445 | 119.235 |
| 0.6201388888888889 | 110.201 |
| 0.6208333333333333 | 96.682 |
| 0.6215277777777778 | 92.184 |
| 0.6222222222222222 | 92.184 |
| 0.6229166666666667 | 96.682 |
| 0.6236111111111111 | 110.201 |
| 0.6243055555555556 | 119.235 |
| 0.625 | 114.716 |
| 0.6256944444444444 | 96.682 |
| 0.6263888888888889 | 78.722 |
| 0.6270833333333333 | 65.31 |
| 0.6277777777777778 | 56.398 |
| 0.6284722222222222 | 47.511 |
| 0.6291666666666667 | 43.079 |
| 0.6298611111111111 | 38.653 |
| 0.6305555555555555 | 38.653 |
| 0.63125 | 38.653 |
| 0.6319444444444444 | 38.653 |
| 0.6326388888888889 | 38.653 |
| 0.6333333333333333 | 38.653 |
| 0.6340277777777777 | 43.079 |
| 0.6347222222222222 | 47.511 |
| 0.6354166666666666 | 51.951 |
| 0.6361111111111112 | 56.398 |
| 0.6368055555555555 | 74.246 |
| 0.6375000000000001 | 96.682 |
| 0.6381944444444444 | 128.284 |
| 0.638888888888889 | 164.605 |
| 0.6395833333333333 | 191.937 |
| 0.6402777777777778 | 210.182 |
| 0.6409722222222222 | 242.127 |
| 0.6416666666666667 | 269.49 |
| 0.642361111111111 | 301.354 |
| 0.6430555555555556 | 342.162 |
| 0.6437499999999999 | 387.202 |
| 0.6444444444444445 | 422.943 |
| 0.6451388888888888 | 440.702 |
| 0.6458333333333334 | 445.129 |
| 0.6465277777777778 | 467.187 |
| 0.6472222222222223 | 489.108 |
| 0.6479166666666667 | 566.793 |
| 0.6486111111111111 | 629.948 |
| 0.6493055555555556 | 687.544 |
| 0.65 | 715.858 |
| 0.6506944444444445 | 687.544 |
| 0.6513888888888889 | 625.784 |
| 0.6520833333333333 | 588.009 |
| 0.6527777777777778 | 654.791 |
| 0.6534722222222222 | 727.896 |
| 0.6541666666666667 | 711.832 |
| 0.6548611111111111 | 617.436 |
| 0.6555555555555556 | 549.704 |
| 0.65625 | 497.836 |
| 0.6569444444444444 | 436.27 |
| 0.6576388888888889 | 427.39 |
| 0.6583333333333333 | 440.702 |
| 0.6590277777777778 | 449.551 |
| 0.6597222222222222 | 453.968 |
| 0.6604166666666667 | 458.38 |
| 0.6611111111111111 | 467.187 |
| 0.6618055555555555 | 467.187 |
| 0.6625 | 462.786 |
| 0.6631944444444444 | 453.968 |
| 0.6638888888888889 | 445.129 |
| 0.6645833333333333 | 431.833 |
| 0.6652777777777777 | 422.943 |
| 0.6659722222222222 | 422.943 |
| 0.6666666666666666 | 427.39 |
| 0.6673611111111111 | 422.943 |
| 0.6680555555555556 | 409.574 |
| 0.6687500000000001 | 409.574 |
| 0.6694444444444444 | 405.108 |
| 0.6701388888888888 | 396.164 |
| 0.6708333333333334 | 391.685 |
| 0.6715277777777778 | 382.715 |
| 0.6722222222222222 | 373.729 |
| 0.6729166666666666 | 382.715 |
| 0.6736111111111112 | 405.108 |
| 0.6743055555555556 | 418.492 |
| 0.6749999999999999 | 427.39 |
| 0.6756944444444444 | 400.638 |
| 0.6763888888888889 | 355.712 |
| 0.6770833333333334 | 342.162 |
| 0.6777777777777777 | 351.198 |
| 0.6784722222222223 | 351.198 |
| 0.6791666666666667 | 333.113 |
| 0.6798611111111111 | 305.898 |
| 0.6805555555555555 | 278.603 |
| 0.68125 | 255.813 |
| 0.6819444444444445 | 255.813 |
| 0.6826388888888889 | 223.873 |
| 0.6833333333333332 | 210.182 |
| 0.6840277777777778 | 196.497 |
| 0.6847222222222222 | 187.378 |
| 0.6854166666666667 | 178.264 |
| 0.686111111111111 | 173.709 |
| 0.6868055555555556 | 169.156 |
| 0.6875 | 169.156 |
| 0.6881944444444444 | 173.709 |
| 0.688888888888889 | 182.82 |
| 0.6895833333333333 | 191.937 |
| 0.6902777777777778 | 210.182 |
| 0.6909722222222222 | 228.436 |
| 0.6916666666666668 | 242.127 |
| 0.6923611111111111 | 251.251 |
| 0.6930555555555555 | 251.251 |
| 0.69375 | 251.251 |
| 0.6944444444444445 | 246.689 |
| 0.6951388888888889 | 246.689 |
| 0.6958333333333333 | 251.251 |
| 0.6965277777777777 | 260.373 |
| 0.6972222222222223 | 264.932 |
| 0.6979166666666666 | 269.49 |
| 0.6986111111111111 | 264.932 |
| 0.6993055555555556 | 260.373 |
| 0.7000000000000001 | 251.251 |
| 0.7006944444444444 | 246.689 |
| 0.7013888888888888 | 246.689 |
| 0.7020833333333334 | 242.127 |
| 0.7027777777777778 | 237.564 |
| 0.7034722222222222 | 233 |
| 0.7041666666666666 | 228.436 |
| 0.7048611111111112 | 214.746 |
| 0.7055555555555556 | 210.182 |
| 0.7062499999999999 | 201.058 |
| 0.7069444444444444 | 201.058 |
| 0.7076388888888889 | 196.497 |
| 0.7083333333333334 | 196.497 |
| 0.7090277777777777 | 191.937 |
| 0.7097222222222223 | 187.378 |
| 0.7104166666666667 | 182.82 |
| 0.7111111111111111 | 182.82 |
| 0.7118055555555555 | 182.82 |
| 0.7125 | 187.378 |
| 0.7131944444444445 | 182.82 |
| 0.7138888888888889 | 182.82 |
| 0.7145833333333332 | 187.378 |
| 0.7152777777777778 | 196.497 |
| 0.7159722222222222 | 210.182 |
| 0.7166666666666667 | 210.182 |
| 0.717361111111111 | 205.62 |
| 0.7180555555555556 | 191.937 |
| 0.71875 | 178.264 |
| 0.7194444444444444 | 164.605 |
| 0.720138888888889 | 160.056 |
| 0.7208333333333333 | 155.509 |
| 0.7215277777777778 | 160.056 |
| 0.7222222222222222 | 160.056 |
| 0.7229166666666668 | 160.056 |
| 0.7236111111111111 | 164.605 |
| 0.7243055555555555 | 169.156 |
| 0.725 | 173.709 |
| 0.7256944444444445 | 173.709 |
| 0.7263888888888889 | 182.82 |
| 0.7270833333333333 | 182.82 |
| 0.7277777777777777 | 187.378 |
| 0.7284722222222223 | 187.378 |
| 0.7291666666666666 | 182.82 |
| 0.7298611111111111 | 178.264 |
| 0.7305555555555556 | 173.709 |
| 0.7312500000000001 | 169.156 |
| 0.7319444444444444 | 160.056 |
| 0.7326388888888888 | 155.509 |
| 0.7333333333333334 | 155.509 |
| 0.7340277777777778 | 155.509 |
| 0.7347222222222222 | 155.509 |
| 0.7354166666666666 | 150.964 |
| 0.7361111111111112 | 146.423 |
| 0.7368055555555556 | 141.884 |
| 0.7374999999999999 | 137.347 |
| 0.7381944444444444 | 132.814 |
| 0.7388888888888889 | 128.284 |
| 0.7395833333333334 | 123.758 |
| 0.7402777777777777 | 123.758 |
| 0.7409722222222223 | 119.235 |
| 0.7416666666666667 | 119.235 |
| 0.7423611111111111 | 114.716 |
| 0.7430555555555555 | 114.716 |
| 0.74375 | 114.716 |
| 0.7444444444444445 | 114.716 |
| 0.7451388888888889 | 114.716 |
| 0.7458333333333332 | 114.716 |
| 0.7465277777777778 | 114.716 |
| 0.7472222222222222 | 110.201 |
| 0.7479166666666667 | 110.201 |
| 0.748611111111111 | 114.716 |
| 0.7493055555555556 | 119.235 |
| 0.75 | 123.758 |
| 0.7506944444444444 | 128.284 |
| 0.751388888888889 | 132.814 |
| 0.7520833333333333 | 137.347 |
| 0.7527777777777778 | 146.423 |
| 0.7534722222222222 | 155.509 |
| 0.7541666666666668 | 160.056 |
| 0.7548611111111111 | 164.605 |
| 0.7555555555555555 | 169.156 |
| 0.75625 | 173.709 |
| 0.7569444444444445 | 169.156 |
| 0.7576388888888889 | 164.605 |
| 0.7583333333333333 | 164.605 |
| 0.7590277777777777 | 160.056 |
| 0.7597222222222223 | 155.509 |
| 0.7604166666666666 | 146.423 |
| 0.7611111111111111 | 137.347 |
| 0.7618055555555556 | 128.284 |
| 0.7625000000000001 | 119.235 |
| 0.7631944444444444 | 119.235 |
| 0.7638888888888888 | 119.235 |
| 0.7645833333333334 | 123.758 |
| 0.7652777777777778 | 128.284 |
| 0.7659722222222222 | 132.814 |
| 0.7666666666666666 | 137.347 |
| 0.7673611111111112 | 137.347 |
| 0.7680555555555556 | 141.884 |
| 0.7687499999999999 | 146.423 |
| 0.7694444444444444 | 150.964 |
| 0.7701388888888889 | 150.964 |
| 0.7708333333333334 | 150.964 |
| 0.7715277777777777 | 150.964 |
| 0.7722222222222223 | 146.423 |
| 0.7729166666666667 | 141.884 |
| 0.7736111111111111 | 128.284 |
| 0.7743055555555555 | 119.235 |
| 0.775 | 114.716 |
| 0.7756944444444445 | 110.201 |
| 0.7763888888888889 | 105.69 |
| 0.7770833333333332 | 105.69 |
| 0.7777777777777778 | 101.184 |
| 0.7784722222222222 | 101.184 |
| 0.7791666666666667 | 101.184 |
| 0.779861111111111 | 101.184 |
| 0.7805555555555556 | 110.201 |
| 0.78125 | 114.716 |
| 0.7819444444444444 | 123.758 |
| 0.782638888888889 | 137.347 |
| 0.7833333333333333 | 146.423 |
| 0.7840277777777778 | 155.509 |
| 0.7847222222222222 | 155.509 |
| 0.7854166666666668 | 146.423 |
| 0.7861111111111111 | 132.814 |
| 0.7868055555555555 | 119.235 |
| 0.7875 | 105.69 |
| 0.7881944444444445 | 96.682 |
| 0.7888888888888889 | 87.692 |
| 0.7895833333333333 | 78.722 |
| 0.7902777777777777 | 74.246 |
| 0.7909722222222223 | 65.31 |
| 0.7916666666666666 | 60.85 |
| 0.7923611111111111 | 56.398 |
| 0.7930555555555556 | 56.398 |
| 0.7937500000000001 | 51.951 |
| 0.7944444444444444 | 51.951 |
| 0.7951388888888888 | 51.951 |
| 0.7958333333333334 | 56.398 |
| 0.7965277777777778 | 56.398 |
| 0.7972222222222222 | 56.398 |
| 0.7979166666666666 | 60.85 |
| 0.7986111111111112 | 60.85 |
| 0.7993055555555556 | 60.85 |
| 0.7999999999999999 | 60.85 |
| 0.8006944444444444 | 60.85 |
| 0.8013888888888889 | 60.85 |
| 0.8020833333333334 | 60.85 |
| 0.8027777777777777 | 60.85 |
| 0.8034722222222223 | 60.85 |
| 0.8041666666666667 | 60.85 |
| 0.8048611111111111 | 60.85 |
| 0.8055555555555555 | 56.398 |
| 0.80625 | 56.398 |
| 0.8069444444444445 | 56.398 |
| 0.8076388888888889 | 56.398 |
| 0.8083333333333332 | 56.398 |
| 0.8090277777777778 | 51.951 |
| 0.8097222222222222 | 47.511 |
| 0.8104166666666667 | 47.511 |
| 0.811111111111111 | 43.079 |
| 0.8118055555555556 | 38.653 |
| 0.8125 | 34.234 |
| 0.8131944444444444 | 34.234 |
| 0.813888888888889 | 29.823 |
| 0.8145833333333333 | 29.823 |
| 0.8152777777777778 | 29.823 |
| 0.8159722222222222 | 29.823 |
| 0.8166666666666668 | 25.419 |
| 0.8173611111111111 | 21.024 |
| 0.8180555555555555 | 21.024 |
| 0.81875 | 21.024 |
| 0.8194444444444445 | 21.024 |
| 0.8201388888888889 | 21.024 |
| 0.8208333333333333 | 16.636 |
| 0.8215277777777777 | 16.636 |
| 0.8222222222222223 | 16.636 |
| 0.8229166666666666 | 16.636 |
| 0.8236111111111111 | 12.257 |
| 0.8243055555555556 | 12.257 |
| 0.8250000000000001 | 12.257 |
| 0.8256944444444444 | 12.257 |
| 0.8263888888888888 | 7.887 |
| 0.8270833333333334 | 7.887 |
| 0.8277777777777778 | 7.887 |
| 0.8284722222222222 | 7.887 |
| 0.8291666666666666 | 7.887 |
| 0.8298611111111112 | 7.887 |
| 0.8305555555555556 | 7.887 |
| 0.8312499999999999 | 3.525 |
| 0.8319444444444444 | 3.525 |
| 0.8326388888888889 | 3.525 |
| 0.8333333333333334 | 3.525 |
| 0.8340277777777777 | 3.525 |
| 0.8347222222222223 | 3.525 |
| 0.8354166666666667 | 3.525 |
| 0.8361111111111111 | 0 |
| 0.8368055555555555 | 0 |
| 0.8375 | 0 |
| 0.8381944444444445 | 0 |
| 0.8388888888888889 | 0 |
| 0.8395833333333332 | 0 |
| 0.8402777777777778 | 0 |
| 0.8409722222222222 | 0 |
| 0.8416666666666667 | 0 |
| 0.842361111111111 | 0 |
| 0.8430555555555556 | 0 |
| 0.84375 | 0 |
| 0.8444444444444444 | 0 |
| 0.845138888888889 | 0 |
| 0.8458333333333333 | 0 |
| 0.8465277777777778 | 0 |
| 0.8472222222222222 | 0 |
| 0.8479166666666668 | 0 |
| 0.8486111111111111 | 0 |
| 0.8493055555555555 | 0 |
| 0.85 | 0 |
| 0.8506944444444445 | 0 |
| 0.8513888888888889 | 0 |
| 0.8520833333333333 | 0 |
| 0.8527777777777777 | 0 |
| 0.8534722222222223 | 0 |
| 0.8541666666666666 | 0 |
| 0.8548611111111111 | 0 |
| 0.8555555555555556 | 0 |
| 0.8562500000000001 | 0 |
| 0.8569444444444444 | 0 |
| 0.8576388888888888 | 0 |
| 0.8583333333333334 | 0 |
| 0.8590277777777778 | 0 |
| 0.8597222222222222 | 0 |
| 0.8604166666666666 | 0 |
| 0.8611111111111112 | 0 |
| 0.8618055555555556 | 0 |
| 0.8624999999999999 | 0 |
| 0.8631944444444444 | 0 |
| 0.8638888888888889 | 0 |
| 0.8645833333333334 | 0 |
| 0.8652777777777777 | 0 |
| 0.8659722222222223 | 0 |
| 0.8666666666666667 | 0 |
| 0.8673611111111111 | 0 |
| 0.8680555555555555 | 0 |
| 0.86875 | 0 |
| 0.8694444444444445 | 0 |
| 0.8701388888888889 | 0 |
| 0.8708333333333332 | 0 |
| 0.8715277777777778 | 0 |
| 0.8722222222222222 | 0 |
| 0.8729166666666667 | 0 |
| 0.873611111111111 | 0 |
| 0.8743055555555556 | 0 |
| 0.875 | 0 |
| 0.8756944444444444 | 0 |
| 0.876388888888889 | 0 |
| 0.8770833333333333 | 0 |
| 0.8777777777777778 | 0 |
| 0.8784722222222222 | 0 |
| 0.8791666666666668 | 0 |
| 0.8798611111111111 | 0 |
| 0.8805555555555555 | 0 |
| 0.88125 | 0 |
| 0.8819444444444445 | 0 |
| 0.8826388888888889 | 0 |
| 0.8833333333333333 | 0 |
| 0.8840277777777777 | 0 |
| 0.8847222222222223 | 0 |
| 0.8854166666666666 | 0 |
| 0.8861111111111111 | 0 |
| 0.8868055555555556 | 0 |
| 0.8875000000000001 | 0 |
| 0.8881944444444444 | 0 |
| 0.8888888888888888 | 0 |
| 0.8895833333333334 | 0 |
| 0.8902777777777778 | 0 |
| 0.8909722222222222 | 0 |
| 0.8916666666666666 | 0 |
| 0.8923611111111112 | 0 |
| 0.8930555555555556 | 0 |
| 0.8937499999999999 | 0 |
| 0.8944444444444444 | 0 |
| 0.8951388888888889 | 0 |
| 0.8958333333333334 | 0 |
| 0.8965277777777777 | 0 |
| 0.8972222222222223 | 0 |
| 0.8979166666666667 | 0 |
| 0.8986111111111111 | 0 |
| 0.8993055555555555 | 0 |
| 0.9 | 0 |
| 0.9006944444444445 | 0 |
| 0.9013888888888889 | 0 |
| 0.9020833333333332 | 0 |
| 0.9027777777777778 | 0 |
| 0.9034722222222222 | 0 |
| 0.9041666666666667 | 0 |
| 0.904861111111111 | 0 |
| 0.9055555555555556 | 0 |
| 0.90625 | 0 |
| 0.9069444444444444 | 0 |
| 0.907638888888889 | 0 |
| 0.9083333333333333 | 0 |
| 0.9090277777777778 | 0 |
| 0.9097222222222222 | 0 |
| 0.9104166666666668 | 0 |
| 0.9111111111111111 | 0 |
| 0.9118055555555555 | 0 |
| 0.9125 | 0 |
| 0.9131944444444445 | 0 |
| 0.9138888888888889 | 0 |
| 0.9145833333333333 | 0 |
| 0.9152777777777777 | 0 |
| 0.9159722222222223 | 0 |
| 0.9166666666666666 | 0 |
| 0.9173611111111111 | 0 |
| 0.9180555555555556 | 0 |
| 0.9187500000000001 | 0 |
| 0.9194444444444444 | 0 |
| 0.9201388888888888 | 0 |
| 0.9208333333333334 | 0 |
| 0.9215277777777778 | 0 |
| 0.9222222222222222 | 0 |
| 0.9229166666666666 | 0 |
| 0.9236111111111112 | 0 |
| 0.9243055555555556 | 0 |
| 0.9249999999999999 | 0 |
| 0.9256944444444444 | 0 |
| 0.9263888888888889 | 0 |
| 0.9270833333333334 | 0 |
| 0.9277777777777777 | 0 |
| 0.9284722222222223 | 0 |
| 0.9291666666666667 | 0 |
| 0.9298611111111111 | 0 |
| 0.9305555555555555 | 0 |
| 0.93125 | 0 |
| 0.9319444444444445 | 0 |
| 0.9326388888888889 | 0 |
| 0.9333333333333332 | 0 |
| 0.9340277777777778 | 0 |
| 0.9347222222222222 | 0 |
| 0.9354166666666667 | 0 |
| 0.936111111111111 | 0 |
| 0.9368055555555556 | 0 |
| 0.9375 | 0 |
| 0.9381944444444444 | 0 |
| 0.938888888888889 | 0 |
| 0.9395833333333333 | 0 |
| 0.9402777777777778 | 0 |
| 0.9409722222222222 | 0 |
| 0.9416666666666668 | 0 |
| 0.9423611111111111 | 0 |
| 0.9430555555555555 | 0 |
| 0.94375 | 0 |
| 0.9444444444444445 | 0 |
| 0.9451388888888889 | 0 |
| 0.9458333333333333 | 0 |
| 0.9465277777777777 | 0 |
| 0.9472222222222223 | 0 |
| 0.9479166666666666 | 0 |
| 0.9486111111111111 | 0 |
| 0.9493055555555556 | 0 |
| 0.9500000000000001 | 0 |
| 0.9506944444444444 | 0 |
| 0.9513888888888888 | 0 |
| 0.9520833333333334 | 0 |
| 0.9527777777777778 | 0 |
| 0.9534722222222222 | 0 |
| 0.9541666666666666 | 0 |
| 0.9548611111111112 | 0 |
| 0.9555555555555556 | 0 |
| 0.9562499999999999 | 0 |
| 0.9569444444444444 | 0 |
| 0.9576388888888889 | 0 |
| 0.9583333333333334 | 0 |
| 0.9590277777777777 | 0 |
| 0.9597222222222223 | 0 |
| 0.9604166666666667 | 0 |
| 0.9611111111111111 | 0 |
| 0.9618055555555555 | 0 |
| 0.9625 | 0 |
| 0.9631944444444445 | 0 |
| 0.9638888888888889 | 0 |
| 0.9645833333333332 | 0 |
| 0.9652777777777778 | 0 |
| 0.9659722222222222 | 0 |
| 0.9666666666666667 | 0 |
| 0.967361111111111 | 0 |
| 0.9680555555555556 | 0 |
| 0.96875 | 0 |
| 0.9694444444444444 | 0 |
| 0.970138888888889 | 0 |
| 0.9708333333333333 | 0 |
| 0.9715277777777778 | 0 |
| 0.9722222222222222 | 0 |
| 0.9729166666666668 | 0 |
| 0.9736111111111111 | 0 |
| 0.9743055555555555 | 0 |
| 0.975 | 0 |
| 0.9756944444444445 | 0 |
| 0.9763888888888889 | 0 |
| 0.9770833333333333 | 0 |
| 0.9777777777777777 | 0 |
| 0.9784722222222223 | 0 |
| 0.9791666666666666 | 0 |
| 0.9798611111111111 | 0 |
| 0.9805555555555556 | 0 |
| 0.9812500000000001 | 0 |
| 0.9819444444444444 | 0 |
| 0.9826388888888888 | 0 |
| 0.9833333333333334 | 0 |
| 0.9840277777777778 | 0 |
| 0.9847222222222222 | 0 |
| 0.9854166666666666 | 0 |
| 0.9861111111111112 | 0 |
| 0.9868055555555556 | 0 |
| 0.9874999999999999 | 0 |
| 0.9881944444444444 | 0 |
| 0.9888888888888889 | 0 |
| 0.9895833333333334 | 0 |
| 0.9902777777777777 | 0 |
| 0.9909722222222223 | 0 |
| 0.9916666666666667 | 0 |
| 0.9923611111111111 | 0 |
| 0.9930555555555555 | 0 |
| 0.99375 | 0 |
| 0.9944444444444445 | 0 |
| 0.9951388888888889 | 0 |
| 0.9958333333333332 | 0 |
| 0.9965277777777778 | 0 |
| 0.9972222222222222 | 0 |
| 0.9979166666666667 | 0 |
| 0.998611111111111 | 0 |
| 0.9993055555555556 | 0 |